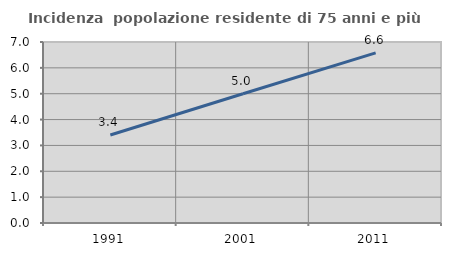
| Category | Incidenza  popolazione residente di 75 anni e più |
|---|---|
| 1991.0 | 3.402 |
| 2001.0 | 4.999 |
| 2011.0 | 6.578 |